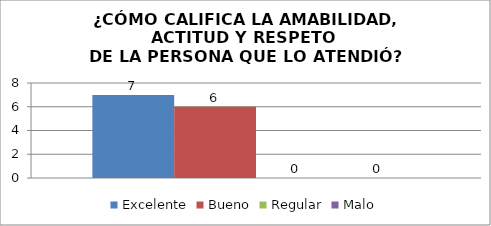
| Category | Excelente | Bueno | Regular | Malo |
|---|---|---|---|---|
| 0 | 7 | 6 | 0 | 0 |